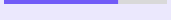
| Category | Series 0 | Series 1 |
|---|---|---|
| 0 | 0.702 | 0.298 |